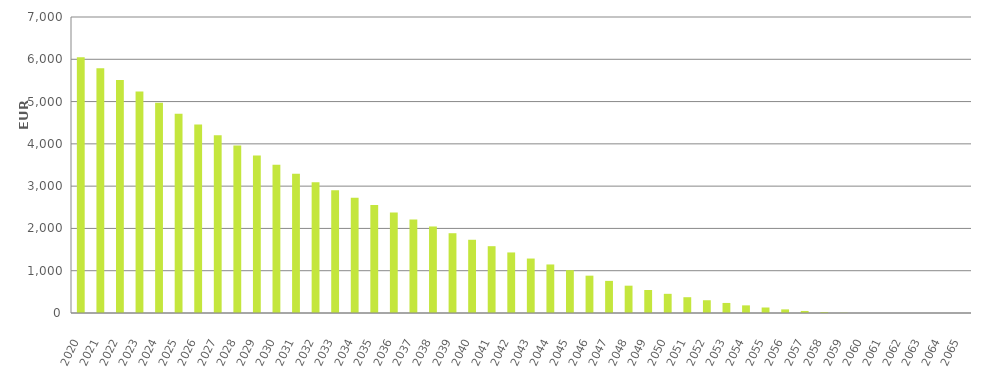
| Category | EUR Millions |
|---|---|
| 2020.0 | 6050000000.08 |
| 2021.0 | 5790820042.692 |
| 2022.0 | 5511379620.534 |
| 2023.0 | 5237928859.915 |
| 2024.0 | 4971028303.396 |
| 2025.0 | 4710505477.945 |
| 2026.0 | 4455203090.557 |
| 2027.0 | 4204768041.623 |
| 2028.0 | 3960473988.242 |
| 2029.0 | 3725112270.511 |
| 2030.0 | 3503223700.313 |
| 2031.0 | 3292760323.719 |
| 2032.0 | 3093404897.058 |
| 2033.0 | 2905238006.23 |
| 2034.0 | 2726065655.429 |
| 2035.0 | 2552262558.894 |
| 2036.0 | 2379572088.799 |
| 2037.0 | 2210684825.45 |
| 2038.0 | 2046090039.613 |
| 2039.0 | 1886755364.405 |
| 2040.0 | 1731821356.728 |
| 2041.0 | 1579921576.109 |
| 2042.0 | 1432047233.567 |
| 2043.0 | 1287854352.009 |
| 2044.0 | 1147766748.8 |
| 2045.0 | 1013254264.339 |
| 2046.0 | 882818344.983 |
| 2047.0 | 759558380.714 |
| 2048.0 | 645946874.08 |
| 2049.0 | 543981038.04 |
| 2050.0 | 453405883.761 |
| 2051.0 | 373416190.799 |
| 2052.0 | 301777740.102 |
| 2053.0 | 237771279.219 |
| 2054.0 | 180558198.286 |
| 2055.0 | 129936710.87 |
| 2056.0 | 85425617.134 |
| 2057.0 | 48238224.657 |
| 2058.0 | 20879990.311 |
| 2059.0 | 5568777.325 |
| 2060.0 | 528944.011 |
| 2061.0 | 132376.88 |
| 2062.0 | 39917.014 |
| 2063.0 | 6746.712 |
| 2064.0 | 0 |
| 2065.0 | 0 |